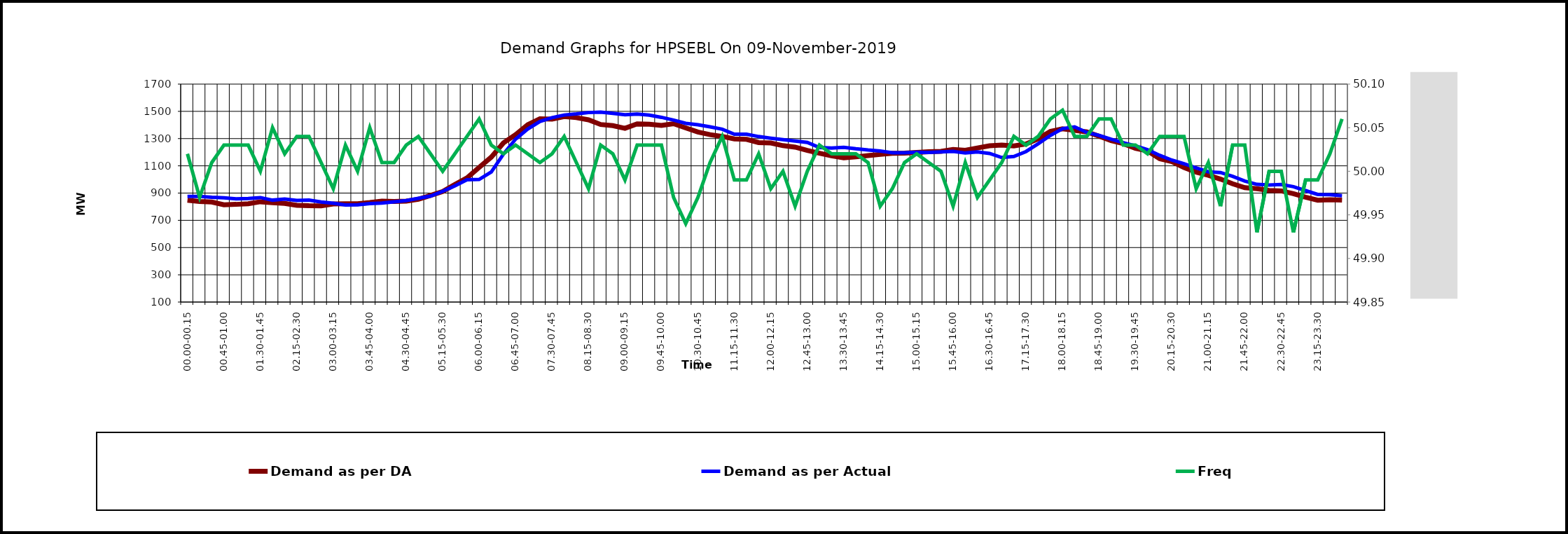
| Category | Demand as per DA | Demand as per Actual |
|---|---|---|
| 00.00-00.15 | 847.284 | 875 |
| 00.15-00.30 | 838.217 | 876 |
| 00.30-00.45 | 834.187 | 869 |
| 00.45-01.00 | 814.037 | 865 |
| 01.00-01.15 | 817.06 | 858 |
| 01.15-01.30 | 822.097 | 860 |
| 01.30-01.45 | 836.202 | 867 |
| 01.45-02:00 | 829.15 | 848 |
| 02.00-02.15 | 824.112 | 856 |
| 02.15-02.30 | 810.008 | 846 |
| 02.30-02.45 | 806.985 | 849 |
| 02.45-03:00 | 805.978 | 834 |
| 03.00-03.15 | 820.082 | 825 |
| 03.15-03.30 | 822.097 | 813 |
| 03.30-03.45 | 822.097 | 814 |
| 03.45-04.00 | 830.157 | 823 |
| 04.00-04.15 | 840.232 | 827 |
| 04.15-04.30 | 838.217 | 836 |
| 04.30-04.45 | 841.239 | 845 |
| 04.45-05.00 | 854.336 | 861 |
| 05.00-05.15 | 882.546 | 878 |
| 05.15-05.30 | 911.762 | 913 |
| 05.30-05.45 | 963.143 | 953 |
| 05.45-06.00 | 1011.502 | 998 |
| 06.00-06.15 | 1088.07 | 1000 |
| 06.15-06.30 | 1163.63 | 1055 |
| 06.30-06.45 | 1268.407 | 1186 |
| 06.45-07.00 | 1328.856 | 1296 |
| 07.00-07.15 | 1401.394 | 1370 |
| 07.15-07.30 | 1445.722 | 1426 |
| 07.30-07.45 | 1442.7 | 1454 |
| 07.45-08.00 | 1461.842 | 1473 |
| 08.00-08.15 | 1453.782 | 1481 |
| 08.15-08.30 | 1437.663 | 1491 |
| 08.30-08.45 | 1403.409 | 1494 |
| 08.45-09.00 | 1395.349 | 1485 |
| 09.00-09.15 | 1375.199 | 1475 |
| 09.15-09.30 | 1408.446 | 1480 |
| 09.30-09.45 | 1405.424 | 1472 |
| 09.45-10.00 | 1396.356 | 1456 |
| 10.00-10.15 | 1409.453 | 1436 |
| 10.15-10.30 | 1378.222 | 1412 |
| 10.30-10.45 | 1347.998 | 1402 |
| 10.45-11.00 | 1328.856 | 1386 |
| 11.00-11.15 | 1315.759 | 1369 |
| 11.15-11.30 | 1297.624 | 1332 |
| 11.30-11.45 | 1294.602 | 1332 |
| 11.45-12.00 | 1270.422 | 1315 |
| 12.00-12.15 | 1267.4 | 1303 |
| 12.15-12.30 | 1248.258 | 1292 |
| 12.30-12.45 | 1237.176 | 1282 |
| 12.45-13.00 | 1212.996 | 1272 |
| 13.00-13.15 | 1192.847 | 1234 |
| 13.15-13.30 | 1173.705 | 1231 |
| 13.30-13.45 | 1158.593 | 1236 |
| 13.45-14.00 | 1165.645 | 1225 |
| 14.00-14.15 | 1174.712 | 1216 |
| 14.15-14.30 | 1183.78 | 1209 |
| 14.30-14.45 | 1191.839 | 1196 |
| 14.45-15.00 | 1192.847 | 1196 |
| 15.00-15.15 | 1197.884 | 1200 |
| 15.15-15.30 | 1202.922 | 1199 |
| 15.30-15.45 | 1205.944 | 1202 |
| 15.45-16.00 | 1220.049 | 1206 |
| 16.00-16.15 | 1214.004 | 1194 |
| 16.15-16.30 | 1231.131 | 1202 |
| 16.30-16.45 | 1247.25 | 1191 |
| 16.45-17.00 | 1252.288 | 1161 |
| 17.00-17.15 | 1246.243 | 1169 |
| 17.15-17.30 | 1260.348 | 1205 |
| 17.30-17.45 | 1298.632 | 1262 |
| 17.45-18.00 | 1352.028 | 1323 |
| 18.00-18.15 | 1372.177 | 1373 |
| 18.15-18.30 | 1360.087 | 1386 |
| 18.30-18.45 | 1349.005 | 1345 |
| 18.45-19.00 | 1317.773 | 1323 |
| 19.00-19.15 | 1284.527 | 1295 |
| 19.15-19.30 | 1263.37 | 1270 |
| 19.30-19.45 | 1229.116 | 1247 |
| 19.45-20.00 | 1209.974 | 1219 |
| 20.00-20.15 | 1151.541 | 1177 |
| 20.15-20.30 | 1130.384 | 1142 |
| 20.30-20.45 | 1087.062 | 1115 |
| 20.45-21.00 | 1053.816 | 1085 |
| 21.00-21.15 | 1030.644 | 1056 |
| 21.15-21.30 | 1002.435 | 1051 |
| 21.30-21.45 | 968.181 | 1023 |
| 21.45-22.00 | 939.971 | 988 |
| 22.00-22.15 | 931.912 | 964 |
| 22.15-22.30 | 919.822 | 959 |
| 22.30-22.45 | 915.792 | 963 |
| 22.45-23.00 | 895.643 | 947 |
| 23.00-23.15 | 869.448 | 918 |
| 23.15-23.30 | 847.284 | 890 |
| 23.30-23.45 | 851.314 | 888 |
| 23.45-24.00 | 848.291 | 881 |